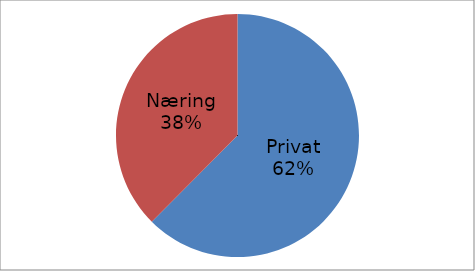
| Category | Series 0 |
|---|---|
| Privat | 46168133 |
| Næring | 27748038 |